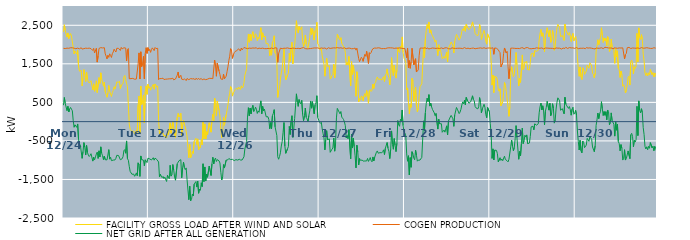
| Category | FACILITY GROSS LOAD AFTER WIND AND SOLAR | COGEN PRODUCTION | NET GRID AFTER ALL GENERATION |
|---|---|---|---|
|  Mon  12/24 | 2329 | 1903 | 426 |
|  Mon  12/24 | 2513 | 1887 | 626 |
|  Mon  12/24 | 2366 | 1895 | 471 |
|  Mon  12/24 | 2353 | 1905 | 448 |
|  Mon  12/24 | 2193 | 1907 | 286 |
|  Mon  12/24 | 2301 | 1905 | 396 |
|  Mon  12/24 | 2153 | 1903 | 250 |
|  Mon  12/24 | 2233 | 1903 | 330 |
|  Mon  12/24 | 2284 | 1917 | 367 |
|  Mon  12/24 | 2221 | 1897 | 324 |
|  Mon  12/24 | 2197 | 1916 | 281 |
|  Mon  12/24 | 1922 | 1897 | 25 |
|  Mon  12/24 | 1759 | 1904 | -145 |
|  Mon  12/24 | 1835 | 1919 | -84 |
|  Mon  12/24 | 1828 | 1892 | -64 |
|  Mon  12/24 | 1750 | 1899 | -149 |
|  Mon  12/24 | 1847 | 1907 | -60 |
|  Mon  12/24 | 1424 | 1891 | -467 |
|  Mon  12/24 | 1309 | 1890 | -581 |
|  Mon  12/24 | 1298 | 1905 | -607 |
|  Mon  12/24 | 1330 | 1917 | -587 |
|  Mon  12/24 | 930 | 1882 | -952 |
|  Mon  12/24 | 1126 | 1901 | -775 |
|  Mon  12/24 | 1350 | 1894 | -544 |
|  Mon  12/24 | 1235 | 1898 | -663 |
|  Mon  12/24 | 1040 | 1906 | -866 |
|  Mon  12/24 | 1283 | 1900 | -617 |
|  Mon  12/24 | 1101 | 1901 | -800 |
|  Mon  12/24 | 1032 | 1901 | -869 |
|  Mon  12/24 | 1003 | 1907 | -904 |
|  Mon  12/24 | 1025 | 1901 | -876 |
|  Mon  12/24 | 1062 | 1894 | -832 |
|  Mon  12/24 | 1085 | 1903 | -818 |
|  Mon  12/24 | 822 | 1846 | -1024 |
|  Mon  12/24 | 981 | 1902 | -921 |
|  Mon  12/24 | 789 | 1781 | -992 |
|  Mon  12/24 | 887 | 1803 | -916 |
|  Mon  12/24 | 1059 | 1901 | -842 |
|  Mon  12/24 | 756 | 1545 | -789 |
|  Mon  12/24 | 747 | 1702 | -955 |
|  Mon  12/24 | 1142 | 1899 | -757 |
|  Mon  12/24 | 992 | 1908 | -916 |
|  Mon  12/24 | 1266 | 1920 | -654 |
|  Mon  12/24 | 1095 | 1914 | -819 |
|  Mon  12/24 | 1026 | 1912 | -886 |
|  Mon  12/24 | 920 | 1905 | -985 |
|  Mon  12/24 | 1026 | 1918 | -892 |
|  Mon  12/24 | 770 | 1758 | -988 |
|  Mon  12/24 | 707 | 1700 | -993 |
|  Mon  12/24 | 633 | 1625 | -992 |
|  Mon  12/24 | 746 | 1725 | -979 |
|  Mon  12/24 | 939 | 1666 | -727 |
|  Mon  12/24 | 787 | 1760 | -973 |
|  Mon  12/24 | 792 | 1715 | -923 |
|  Mon  12/24 | 653 | 1665 | -1012 |
|  Mon  12/24 | 756 | 1763 | -1007 |
|  Mon  12/24 | 809 | 1807 | -998 |
|  Mon  12/24 | 907 | 1880 | -973 |
|  Mon  12/24 | 842 | 1835 | -993 |
|  Mon  12/24 | 856 | 1806 | -950 |
|  Mon  12/24 | 1031 | 1904 | -873 |
|  Mon  12/24 | 1029 | 1896 | -867 |
|  Mon  12/24 | 1020 | 1900 | -880 |
|  Mon  12/24 | 1050 | 1913 | -863 |
|  Mon  12/24 | 858 | 1847 | -989 |
|  Mon  12/24 | 949 | 1926 | -977 |
|  Mon  12/24 | 924 | 1887 | -963 |
|  Mon  12/24 | 987 | 1895 | -908 |
|  Mon  12/24 | 1164 | 1916 | -752 |
|  Mon  12/24 | 1198 | 1923 | -725 |
|  Mon  12/24 | 1089 | 1909 | -820 |
|  Mon  12/24 | 1073 | 1574 | -501 |
|  Mon  12/24 | 904 | 1866 | -962 |
|  Mon  12/24 | 895 | 1897 | -1002 |
|  Mon  12/24 | -46 | 1113 | -1159 |
|  Mon  12/24 | -198 | 1091 | -1289 |
|  Mon  12/24 | -193 | 1116 | -1309 |
|  Mon  12/24 | -254 | 1111 | -1365 |
|  Mon  12/24 | -247 | 1122 | -1369 |
|  Mon  12/24 | -248 | 1113 | -1361 |
|  Mon  12/24 | -318 | 1100 | -1418 |
|  Mon  12/24 | -286 | 1099 | -1385 |
|  Mon  12/24 | -225 | 1105 | -1330 |
|  Mon  12/24 | -284 | 1119 | -1403 |
|  Mon  12/24 | 431 | 1500 | -1069 |
|  Mon  12/24 | 666 | 1783 | -1117 |
|  Mon  12/24 | -316 | 1105 | -1421 |
|  Mon  12/24 | 922 | 1812 | -890 |
|  Mon  12/24 | 442 | 1427 | -985 |
|  Mon  12/24 | 531 | 1512 | -981 |
|  Mon  12/24 | 692 | 1693 | -1001 |
|  Mon  12/24 | -35 | 1110 | -1145 |
|  Mon  12/24 | 776 | 1766 | -990 |
|  Mon  12/24 | 928 | 1918 | -990 |
|  Mon  12/24 | 707 | 1769 | -1062 |
|  Mon  12/24 | 972 | 1920 | -948 |
|  Tue  12/25 | 867 | 1839 | -972 |
|  Tue  12/25 | 908 | 1875 | -967 |
|  Tue  12/25 | 815 | 1797 | -982 |
|  Tue  12/25 | 875 | 1871 | -996 |
|  Tue  12/25 | 922 | 1914 | -992 |
|  Tue  12/25 | 967 | 1903 | -936 |
|  Tue  12/25 | 842 | 1842 | -1000 |
|  Tue  12/25 | 978 | 1924 | -946 |
|  Tue  12/25 | 948 | 1896 | -948 |
|  Tue  12/25 | 891 | 1874 | -983 |
|  Tue  12/25 | 928 | 1902 | -974 |
|  Tue  12/25 | 41 | 1088 | -1047 |
|  Tue  12/25 | -320 | 1117 | -1437 |
|  Tue  12/25 | -260 | 1106 | -1366 |
|  Tue  12/25 | -296 | 1117 | -1413 |
|  Tue  12/25 | -320 | 1133 | -1453 |
|  Tue  12/25 | -294 | 1127 | -1421 |
|  Tue  12/25 | -385 | 1093 | -1478 |
|  Tue  12/25 | -347 | 1093 | -1440 |
|  Tue  12/25 | -322 | 1101 | -1423 |
|  Tue  12/25 | -427 | 1126 | -1553 |
|  Tue  12/25 | -287 | 1105 | -1392 |
|  Tue  12/25 | -348 | 1107 | -1455 |
|  Tue  12/25 | -371 | 1111 | -1482 |
|  Tue  12/25 | -31 | 1102 | -1133 |
|  Tue  12/25 | -303 | 1111 | -1414 |
|  Tue  12/25 | -284 | 1096 | -1380 |
|  Tue  12/25 | 14 | 1127 | -1113 |
|  Tue  12/25 | -174 | 1084 | -1258 |
|  Tue  12/25 | -345 | 1090 | -1435 |
|  Tue  12/25 | -414 | 1105 | -1519 |
|  Tue  12/25 | -399 | 1129 | -1528 |
|  Tue  12/25 | 115 | 1206 | -1091 |
|  Tue  12/25 | 215 | 1288 | -1073 |
|  Tue  12/25 | 121 | 1133 | -1012 |
|  Tue  12/25 | 160 | 1150 | -990 |
|  Tue  12/25 | 215 | 1203 | -988 |
|  Tue  12/25 | -355 | 1102 | -1457 |
|  Tue  12/25 | -85 | 1114 | -1199 |
|  Tue  12/25 | 37 | 1088 | -1051 |
|  Tue  12/25 | -80 | 1114 | -1194 |
|  Tue  12/25 | -128 | 1117 | -1245 |
|  Tue  12/25 | -135 | 1065 | -1200 |
|  Tue  12/25 | -381 | 1119 | -1500 |
|  Tue  12/25 | -406 | 1104 | -1510 |
|  Tue  12/25 | -936 | 1089 | -2025 |
|  Tue  12/25 | -590 | 1085 | -1675 |
|  Tue  12/25 | -942 | 1116 | -2058 |
|  Tue  12/25 | -900 | 1118 | -2018 |
|  Tue  12/25 | -769 | 1109 | -1878 |
|  Tue  12/25 | -827 | 1100 | -1927 |
|  Tue  12/25 | -510 | 1113 | -1623 |
|  Tue  12/25 | -515 | 1085 | -1600 |
|  Tue  12/25 | -431 | 1123 | -1554 |
|  Tue  12/25 | -594 | 1103 | -1697 |
|  Tue  12/25 | -448 | 1096 | -1544 |
|  Tue  12/25 | -734 | 1124 | -1858 |
|  Tue  12/25 | -654 | 1094 | -1748 |
|  Tue  12/25 | -683 | 1099 | -1782 |
|  Tue  12/25 | -468 | 1119 | -1587 |
|  Tue  12/25 | -599 | 1086 | -1685 |
|  Tue  12/25 | -1 | 1092 | -1093 |
|  Tue  12/25 | -450 | 1106 | -1556 |
|  Tue  12/25 | -60 | 1116 | -1176 |
|  Tue  12/25 | -452 | 1089 | -1541 |
|  Tue  12/25 | -262 | 1099 | -1361 |
|  Tue  12/25 | -341 | 1102 | -1443 |
|  Tue  12/25 | -336 | 1108 | -1444 |
|  Tue  12/25 | -30 | 1122 | -1152 |
|  Tue  12/25 | -40 | 1103 | -1143 |
|  Tue  12/25 | -273 | 1123 | -1396 |
|  Tue  12/25 | 24 | 1122 | -1098 |
|  Tue  12/25 | 191 | 1115 | -924 |
|  Tue  12/25 | 19 | 1115 | -1096 |
|  Tue  12/25 | 610 | 1597 | -987 |
|  Tue  12/25 | 499 | 1444 | -945 |
|  Tue  12/25 | 144 | 1178 | -1034 |
|  Tue  12/25 | 532 | 1518 | -986 |
|  Tue  12/25 | 550 | 1529 | -979 |
|  Tue  12/25 | 294 | 1310 | -1016 |
|  Tue  12/25 | 147 | 1220 | -1073 |
|  Tue  12/25 | -207 | 1108 | -1315 |
|  Tue  12/25 | -414 | 1099 | -1513 |
|  Tue  12/25 | -333 | 1093 | -1426 |
|  Tue  12/25 | 119 | 1233 | -1114 |
|  Tue  12/25 | -94 | 1110 | -1204 |
|  Tue  12/25 | -102 | 1107 | -1209 |
|  Tue  12/25 | 181 | 1179 | -998 |
|  Tue  12/25 | 295 | 1296 | -1001 |
|  Tue  12/25 | 431 | 1421 | -990 |
|  Tue  12/25 | 628 | 1586 | -958 |
|  Tue  12/25 | 738 | 1698 | -960 |
|  Tue  12/25 | 913 | 1896 | -983 |
|  Tue  12/25 | 874 | 1858 | -984 |
|  Tue  12/25 | 662 | 1640 | -978 |
|  Tue  12/25 | 751 | 1728 | -977 |
|  Wed  12/26 | 778 | 1788 | -1010 |
|  Wed  12/26 | 830 | 1819 | -989 |
|  Wed  12/26 | 814 | 1800 | -986 |
|  Wed  12/26 | 876 | 1844 | -968 |
|  Wed  12/26 | 832 | 1830 | -998 |
|  Wed  12/26 | 897 | 1889 | -992 |
|  Wed  12/26 | 922 | 1895 | -973 |
|  Wed  12/26 | 832 | 1831 | -999 |
|  Wed  12/26 | 930 | 1910 | -980 |
|  Wed  12/26 | 870 | 1863 | -993 |
|  Wed  12/26 | 897 | 1896 | -999 |
|  Wed  12/26 | 1011 | 1923 | -912 |
|  Wed  12/26 | 1202 | 1912 | -710 |
|  Wed  12/26 | 1203 | 1907 | -704 |
|  Wed  12/26 | 1374 | 1887 | -513 |
|  Wed  12/26 | 2012 | 1894 | 118 |
|  Wed  12/26 | 2274 | 1912 | 362 |
|  Wed  12/26 | 2060 | 1907 | 153 |
|  Wed  12/26 | 2273 | 1921 | 352 |
|  Wed  12/26 | 2103 | 1902 | 201 |
|  Wed  12/26 | 2255 | 1906 | 349 |
|  Wed  12/26 | 2334 | 1911 | 423 |
|  Wed  12/26 | 2164 | 1901 | 263 |
|  Wed  12/26 | 2212 | 1907 | 305 |
|  Wed  12/26 | 2279 | 1904 | 375 |
|  Wed  12/26 | 2239 | 1917 | 322 |
|  Wed  12/26 | 2101 | 1889 | 212 |
|  Wed  12/26 | 2185 | 1906 | 279 |
|  Wed  12/26 | 2150 | 1907 | 243 |
|  Wed  12/26 | 2312 | 1901 | 411 |
|  Wed  12/26 | 2437 | 1898 | 539 |
|  Wed  12/26 | 2120 | 1917 | 203 |
|  Wed  12/26 | 2305 | 1907 | 398 |
|  Wed  12/26 | 2199 | 1919 | 280 |
|  Wed  12/26 | 2220 | 1895 | 325 |
|  Wed  12/26 | 2212 | 1904 | 308 |
|  Wed  12/26 | 2018 | 1892 | 126 |
|  Wed  12/26 | 2015 | 1896 | 119 |
|  Wed  12/26 | 2027 | 1900 | 127 |
|  Wed  12/26 | 1955 | 1904 | 51 |
|  Wed  12/26 | 1710 | 1895 | -185 |
|  Wed  12/26 | 1863 | 1888 | -25 |
|  Wed  12/26 | 1725 | 1910 | -185 |
|  Wed  12/26 | 2060 | 1906 | 154 |
|  Wed  12/26 | 2109 | 1894 | 215 |
|  Wed  12/26 | 2228 | 1917 | 311 |
|  Wed  12/26 | 1779 | 1915 | -136 |
|  Wed  12/26 | 1742 | 1899 | -157 |
|  Wed  12/26 | 1549 | 1911 | -362 |
|  Wed  12/26 | 629 | 1540 | -911 |
|  Wed  12/26 | 792 | 1768 | -976 |
|  Wed  12/26 | 862 | 1766 | -904 |
|  Wed  12/26 | 1098 | 1907 | -809 |
|  Wed  12/26 | 1262 | 1895 | -633 |
|  Wed  12/26 | 1378 | 1893 | -515 |
|  Wed  12/26 | 1634 | 1910 | -276 |
|  Wed  12/26 | 1881 | 1905 | -24 |
|  Wed  12/26 | 1264 | 1900 | -636 |
|  Wed  12/26 | 1080 | 1903 | -823 |
|  Wed  12/26 | 1087 | 1911 | -824 |
|  Wed  12/26 | 1208 | 1913 | -705 |
|  Wed  12/26 | 1261 | 1904 | -643 |
|  Wed  12/26 | 1775 | 1899 | -124 |
|  Wed  12/26 | 1562 | 1895 | -333 |
|  Wed  12/26 | 1908 | 1896 | 12 |
|  Wed  12/26 | 2060 | 1906 | 154 |
|  Wed  12/26 | 1502 | 1909 | -407 |
|  Wed  12/26 | 1729 | 1909 | -180 |
|  Wed  12/26 | 1982 | 1902 | 80 |
|  Wed  12/26 | 2300 | 1893 | 407 |
|  Wed  12/26 | 2618 | 1897 | 721 |
|  Wed  12/26 | 2395 | 1886 | 509 |
|  Wed  12/26 | 2299 | 1903 | 396 |
|  Wed  12/26 | 2468 | 1896 | 572 |
|  Wed  12/26 | 2384 | 1892 | 492 |
|  Wed  12/26 | 2373 | 1912 | 461 |
|  Wed  12/26 | 2462 | 1910 | 552 |
|  Wed  12/26 | 2076 | 1894 | 182 |
|  Wed  12/26 | 1949 | 1922 | 27 |
|  Wed  12/26 | 2050 | 1900 | 150 |
|  Wed  12/26 | 2248 | 1895 | 353 |
|  Wed  12/26 | 2010 | 1898 | 112 |
|  Wed  12/26 | 1958 | 1888 | 70 |
|  Wed  12/26 | 1908 | 1906 | 2 |
|  Wed  12/26 | 2050 | 1892 | 158 |
|  Wed  12/26 | 2180 | 1901 | 279 |
|  Wed  12/26 | 2433 | 1897 | 536 |
|  Wed  12/26 | 2259 | 1910 | 349 |
|  Wed  12/26 | 2422 | 1904 | 518 |
|  Wed  12/26 | 2440 | 1898 | 542 |
|  Wed  12/26 | 2117 | 1912 | 205 |
|  Wed  12/26 | 2358 | 1920 | 438 |
|  Wed  12/26 | 2397 | 1910 | 487 |
|  Wed  12/26 | 2576 | 1904 | 672 |
|  Wed  12/26 | 2019 | 1913 | 106 |
|  Wed  12/26 | 1988 | 1904 | 84 |
|  Thu  12/27 | 1882 | 1896 | -14 |
|  Thu  12/27 | 1853 | 1897 | -44 |
|  Thu  12/27 | 1894 | 1912 | -18 |
|  Thu  12/27 | 1709 | 1899 | -190 |
|  Thu  12/27 | 1591 | 1902 | -311 |
|  Thu  12/27 | 1487 | 1911 | -424 |
|  Thu  12/27 | 1178 | 1911 | -733 |
|  Thu  12/27 | 1439 | 1903 | -464 |
|  Thu  12/27 | 1650 | 1884 | -234 |
|  Thu  12/27 | 1436 | 1906 | -470 |
|  Thu  12/27 | 1431 | 1917 | -486 |
|  Thu  12/27 | 1448 | 1895 | -447 |
|  Thu  12/27 | 1103 | 1899 | -796 |
|  Thu  12/27 | 1130 | 1910 | -780 |
|  Thu  12/27 | 1192 | 1907 | -715 |
|  Thu  12/27 | 1218 | 1903 | -685 |
|  Thu  12/27 | 1488 | 1914 | -426 |
|  Thu  12/27 | 1137 | 1903 | -766 |
|  Thu  12/27 | 1329 | 1911 | -582 |
|  Thu  12/27 | 1999 | 1903 | 96 |
|  Thu  12/27 | 2265 | 1921 | 344 |
|  Thu  12/27 | 2267 | 1902 | 365 |
|  Thu  12/27 | 2158 | 1909 | 249 |
|  Thu  12/27 | 2117 | 1913 | 204 |
|  Thu  12/27 | 2179 | 1916 | 263 |
|  Thu  12/27 | 2029 | 1912 | 117 |
|  Thu  12/27 | 1990 | 1902 | 88 |
|  Thu  12/27 | 1976 | 1922 | 54 |
|  Thu  12/27 | 1905 | 1915 | -10 |
|  Thu  12/27 | 1801 | 1905 | -104 |
|  Thu  12/27 | 1467 | 1891 | -424 |
|  Thu  12/27 | 1540 | 1903 | -363 |
|  Thu  12/27 | 1466 | 1907 | -441 |
|  Thu  12/27 | 1689 | 1897 | -208 |
|  Thu  12/27 | 1703 | 1906 | -203 |
|  Thu  12/27 | 929 | 1892 | -963 |
|  Thu  12/27 | 1558 | 1891 | -333 |
|  Thu  12/27 | 1226 | 1911 | -685 |
|  Thu  12/27 | 1462 | 1893 | -431 |
|  Thu  12/27 | 1267 | 1917 | -650 |
|  Thu  12/27 | 1022 | 1909 | -887 |
|  Thu  12/27 | 656 | 1855 | -1199 |
|  Thu  12/27 | 1294 | 1906 | -612 |
|  Thu  12/27 | 1122 | 1906 | -784 |
|  Thu  12/27 | 511 | 1636 | -1125 |
|  Thu  12/27 | 599 | 1556 | -957 |
|  Thu  12/27 | 557 | 1561 | -1004 |
|  Thu  12/27 | 668 | 1669 | -1001 |
|  Thu  12/27 | 641 | 1638 | -997 |
|  Thu  12/27 | 540 | 1564 | -1024 |
|  Thu  12/27 | 669 | 1668 | -999 |
|  Thu  12/27 | 727 | 1748 | -1021 |
|  Thu  12/27 | 652 | 1694 | -1042 |
|  Thu  12/27 | 805 | 1825 | -1020 |
|  Thu  12/27 | 697 | 1652 | -955 |
|  Thu  12/27 | 477 | 1509 | -1032 |
|  Thu  12/27 | 800 | 1789 | -989 |
|  Thu  12/27 | 831 | 1763 | -932 |
|  Thu  12/27 | 782 | 1791 | -1009 |
|  Thu  12/27 | 812 | 1854 | -1042 |
|  Thu  12/27 | 976 | 1892 | -916 |
|  Thu  12/27 | 861 | 1880 | -1019 |
|  Thu  12/27 | 987 | 1910 | -923 |
|  Thu  12/27 | 1016 | 1925 | -909 |
|  Thu  12/27 | 1114 | 1906 | -792 |
|  Thu  12/27 | 1160 | 1920 | -760 |
|  Thu  12/27 | 1097 | 1916 | -819 |
|  Thu  12/27 | 1099 | 1904 | -805 |
|  Thu  12/27 | 1105 | 1909 | -804 |
|  Thu  12/27 | 1082 | 1897 | -815 |
|  Thu  12/27 | 1083 | 1892 | -809 |
|  Thu  12/27 | 1127 | 1910 | -783 |
|  Thu  12/27 | 1165 | 1897 | -732 |
|  Thu  12/27 | 1040 | 1894 | -854 |
|  Thu  12/27 | 1199 | 1893 | -694 |
|  Thu  12/27 | 1243 | 1914 | -671 |
|  Thu  12/27 | 1368 | 1910 | -542 |
|  Thu  12/27 | 1202 | 1894 | -692 |
|  Thu  12/27 | 1146 | 1916 | -770 |
|  Thu  12/27 | 951 | 1910 | -959 |
|  Thu  12/27 | 1196 | 1914 | -718 |
|  Thu  12/27 | 1660 | 1901 | -241 |
|  Thu  12/27 | 1323 | 1912 | -589 |
|  Thu  12/27 | 1193 | 1909 | -716 |
|  Thu  12/27 | 1461 | 1900 | -439 |
|  Thu  12/27 | 1276 | 1890 | -614 |
|  Thu  12/27 | 1130 | 1908 | -778 |
|  Thu  12/27 | 1348 | 1908 | -560 |
|  Thu  12/27 | 1930 | 1904 | 26 |
|  Thu  12/27 | 1828 | 1908 | -80 |
|  Thu  12/27 | 1793 | 1914 | -121 |
|  Thu  12/27 | 1955 | 1891 | 64 |
|  Thu  12/27 | 1918 | 1904 | 14 |
|  Thu  12/27 | 2198 | 1896 | 302 |
|  Thu  12/27 | 1793 | 1898 | -105 |
|  Thu  12/27 | 1641 | 1904 | -263 |
|  Fri  12/28 | 1603 | 1898 | -295 |
|  Fri  12/28 | 1534 | 1907 | -373 |
|  Fri  12/28 | 823 | 1660 | -837 |
|  Fri  12/28 | 875 | 1902 | -1027 |
|  Fri  12/28 | 516 | 1401 | -885 |
|  Fri  12/28 | 199 | 1583 | -1384 |
|  Fri  12/28 | 451 | 1384 | -933 |
|  Fri  12/28 | 372 | 1556 | -1184 |
|  Fri  12/28 | 1123 | 1903 | -780 |
|  Fri  12/28 | 1060 | 1900 | -840 |
|  Fri  12/28 | 525 | 1470 | -945 |
|  Fri  12/28 | 504 | 1494 | -990 |
|  Fri  12/28 | 892 | 1632 | -740 |
|  Fri  12/28 | 412 | 1287 | -875 |
|  Fri  12/28 | 254 | 1280 | -1026 |
|  Fri  12/28 | 343 | 1342 | -999 |
|  Fri  12/28 | 691 | 1709 | -1018 |
|  Fri  12/28 | 909 | 1906 | -997 |
|  Fri  12/28 | 922 | 1911 | -989 |
|  Fri  12/28 | 982 | 1909 | -927 |
|  Fri  12/28 | 986 | 1915 | -929 |
|  Fri  12/28 | 1926 | 1906 | 20 |
|  Fri  12/28 | 1658 | 1898 | -240 |
|  Fri  12/28 | 2149 | 1919 | 230 |
|  Fri  12/28 | 2361 | 1888 | 473 |
|  Fri  12/28 | 2521 | 1914 | 607 |
|  Fri  12/28 | 2418 | 1896 | 522 |
|  Fri  12/28 | 2586 | 1886 | 700 |
|  Fri  12/28 | 2308 | 1904 | 404 |
|  Fri  12/28 | 2380 | 1898 | 482 |
|  Fri  12/28 | 2272 | 1888 | 384 |
|  Fri  12/28 | 2228 | 1911 | 317 |
|  Fri  12/28 | 2214 | 1907 | 307 |
|  Fri  12/28 | 2133 | 1905 | 228 |
|  Fri  12/28 | 2061 | 1907 | 154 |
|  Fri  12/28 | 2113 | 1900 | 213 |
|  Fri  12/28 | 2126 | 1916 | 210 |
|  Fri  12/28 | 1713 | 1906 | -193 |
|  Fri  12/28 | 1994 | 1928 | 66 |
|  Fri  12/28 | 1841 | 1896 | -55 |
|  Fri  12/28 | 1872 | 1916 | -44 |
|  Fri  12/28 | 1860 | 1914 | -54 |
|  Fri  12/28 | 1627 | 1903 | -276 |
|  Fri  12/28 | 1617 | 1894 | -277 |
|  Fri  12/28 | 1691 | 1910 | -219 |
|  Fri  12/28 | 1641 | 1914 | -273 |
|  Fri  12/28 | 1730 | 1915 | -185 |
|  Fri  12/28 | 1807 | 1916 | -109 |
|  Fri  12/28 | 1551 | 1894 | -343 |
|  Fri  12/28 | 1908 | 1893 | 15 |
|  Fri  12/28 | 1915 | 1903 | 12 |
|  Fri  12/28 | 2006 | 1886 | 120 |
|  Fri  12/28 | 2068 | 1906 | 162 |
|  Fri  12/28 | 2092 | 1916 | 176 |
|  Fri  12/28 | 1977 | 1904 | 73 |
|  Fri  12/28 | 1780 | 1902 | -122 |
|  Fri  12/28 | 2085 | 1916 | 169 |
|  Fri  12/28 | 2088 | 1900 | 188 |
|  Fri  12/28 | 2263 | 1896 | 367 |
|  Fri  12/28 | 2225 | 1903 | 322 |
|  Fri  12/28 | 2238 | 1923 | 315 |
|  Fri  12/28 | 2113 | 1905 | 208 |
|  Fri  12/28 | 2154 | 1907 | 247 |
|  Fri  12/28 | 2223 | 1903 | 320 |
|  Fri  12/28 | 2343 | 1912 | 431 |
|  Fri  12/28 | 2407 | 1895 | 512 |
|  Fri  12/28 | 2364 | 1902 | 462 |
|  Fri  12/28 | 2473 | 1921 | 552 |
|  Fri  12/28 | 2344 | 1907 | 437 |
|  Fri  12/28 | 2525 | 1896 | 629 |
|  Fri  12/28 | 2465 | 1902 | 563 |
|  Fri  12/28 | 2454 | 1906 | 548 |
|  Fri  12/28 | 2389 | 1912 | 477 |
|  Fri  12/28 | 2366 | 1892 | 474 |
|  Fri  12/28 | 2435 | 1917 | 518 |
|  Fri  12/28 | 2427 | 1903 | 524 |
|  Fri  12/28 | 2587 | 1917 | 670 |
|  Fri  12/28 | 2479 | 1909 | 570 |
|  Fri  12/28 | 2444 | 1905 | 539 |
|  Fri  12/28 | 2282 | 1891 | 391 |
|  Fri  12/28 | 2253 | 1897 | 356 |
|  Fri  12/28 | 2236 | 1901 | 335 |
|  Fri  12/28 | 2230 | 1899 | 331 |
|  Fri  12/28 | 2290 | 1906 | 384 |
|  Fri  12/28 | 2523 | 1900 | 623 |
|  Fri  12/28 | 2412 | 1913 | 499 |
|  Fri  12/28 | 2133 | 1908 | 225 |
|  Fri  12/28 | 2230 | 1902 | 328 |
|  Fri  12/28 | 2241 | 1913 | 328 |
|  Fri  12/28 | 2367 | 1917 | 450 |
|  Fri  12/28 | 2269 | 1899 | 370 |
|  Fri  12/28 | 2081 | 1899 | 182 |
|  Fri  12/28 | 2009 | 1908 | 101 |
|  Fri  12/28 | 2277 | 1909 | 368 |
|  Fri  12/28 | 2272 | 1884 | 388 |
|  Fri  12/28 | 2168 | 1911 | 257 |
|  Sat  12/29 | 1862 | 1913 | -51 |
|  Sat  12/29 | 1582 | 1905 | -323 |
|  Sat  12/29 | 948 | 1902 | -954 |
|  Sat  12/29 | 1210 | 1916 | -706 |
|  Sat  12/29 | 753 | 1747 | -994 |
|  Sat  12/29 | 1173 | 1912 | -739 |
|  Sat  12/29 | 1173 | 1919 | -746 |
|  Sat  12/29 | 1155 | 1902 | -747 |
|  Sat  12/29 | 1075 | 1905 | -830 |
|  Sat  12/29 | 819 | 1866 | -1047 |
|  Sat  12/29 | 788 | 1823 | -1035 |
|  Sat  12/29 | 853 | 1790 | -937 |
|  Sat  12/29 | 414 | 1420 | -1006 |
|  Sat  12/29 | 433 | 1402 | -969 |
|  Sat  12/29 | 517 | 1531 | -1014 |
|  Sat  12/29 | 751 | 1770 | -1019 |
|  Sat  12/29 | 1015 | 1911 | -896 |
|  Sat  12/29 | 942 | 1923 | -981 |
|  Sat  12/29 | 784 | 1780 | -996 |
|  Sat  12/29 | 804 | 1820 | -1016 |
|  Sat  12/29 | 379 | 1422 | -1043 |
|  Sat  12/29 | 138 | 1113 | -975 |
|  Sat  12/29 | 387 | 1379 | -992 |
|  Sat  12/29 | 1250 | 1906 | -656 |
|  Sat  12/29 | 1425 | 1905 | -480 |
|  Sat  12/29 | 1269 | 1907 | -638 |
|  Sat  12/29 | 1165 | 1921 | -756 |
|  Sat  12/29 | 1233 | 1903 | -670 |
|  Sat  12/29 | 1464 | 1909 | -445 |
|  Sat  12/29 | 1794 | 1898 | -104 |
|  Sat  12/29 | 1472 | 1887 | -415 |
|  Sat  12/29 | 1463 | 1900 | -437 |
|  Sat  12/29 | 923 | 1899 | -976 |
|  Sat  12/29 | 1121 | 1896 | -775 |
|  Sat  12/29 | 1018 | 1908 | -890 |
|  Sat  12/29 | 1338 | 1916 | -578 |
|  Sat  12/29 | 1731 | 1899 | -168 |
|  Sat  12/29 | 1346 | 1915 | -569 |
|  Sat  12/29 | 1388 | 1885 | -497 |
|  Sat  12/29 | 1556 | 1908 | -352 |
|  Sat  12/29 | 1518 | 1917 | -399 |
|  Sat  12/29 | 1567 | 1911 | -344 |
|  Sat  12/29 | 1351 | 1921 | -570 |
|  Sat  12/29 | 1329 | 1905 | -576 |
|  Sat  12/29 | 1339 | 1895 | -556 |
|  Sat  12/29 | 1538 | 1920 | -382 |
|  Sat  12/29 | 1756 | 1890 | -134 |
|  Sat  12/29 | 1773 | 1902 | -129 |
|  Sat  12/29 | 1779 | 1899 | -120 |
|  Sat  12/29 | 1686 | 1899 | -213 |
|  Sat  12/29 | 1840 | 1898 | -58 |
|  Sat  12/29 | 1824 | 1905 | -81 |
|  Sat  12/29 | 1825 | 1916 | -91 |
|  Sat  12/29 | 1842 | 1927 | -85 |
|  Sat  12/29 | 1851 | 1906 | -55 |
|  Sat  12/29 | 2121 | 1892 | 229 |
|  Sat  12/29 | 2295 | 1904 | 391 |
|  Sat  12/29 | 2390 | 1910 | 480 |
|  Sat  12/29 | 2215 | 1912 | 303 |
|  Sat  12/29 | 2304 | 1893 | 411 |
|  Sat  12/29 | 2170 | 1887 | 283 |
|  Sat  12/29 | 1809 | 1895 | -86 |
|  Sat  12/29 | 2179 | 1910 | 269 |
|  Sat  12/29 | 2297 | 1924 | 373 |
|  Sat  12/29 | 2435 | 1908 | 527 |
|  Sat  12/29 | 2435 | 1896 | 539 |
|  Sat  12/29 | 2203 | 1904 | 299 |
|  Sat  12/29 | 2372 | 1895 | 477 |
|  Sat  12/29 | 2058 | 1903 | 155 |
|  Sat  12/29 | 2128 | 1909 | 219 |
|  Sat  12/29 | 2367 | 1901 | 466 |
|  Sat  12/29 | 2259 | 1909 | 350 |
|  Sat  12/29 | 1851 | 1889 | -38 |
|  Sat  12/29 | 1955 | 1914 | 41 |
|  Sat  12/29 | 2238 | 1912 | 326 |
|  Sat  12/29 | 2422 | 1919 | 503 |
|  Sat  12/29 | 2524 | 1906 | 618 |
|  Sat  12/29 | 2518 | 1917 | 601 |
|  Sat  12/29 | 2447 | 1906 | 541 |
|  Sat  12/29 | 2206 | 1910 | 296 |
|  Sat  12/29 | 2192 | 1884 | 308 |
|  Sat  12/29 | 2233 | 1896 | 337 |
|  Sat  12/29 | 2179 | 1908 | 271 |
|  Sat  12/29 | 2107 | 1904 | 203 |
|  Sat  12/29 | 2531 | 1899 | 632 |
|  Sat  12/29 | 2384 | 1928 | 456 |
|  Sat  12/29 | 2327 | 1916 | 411 |
|  Sat  12/29 | 2307 | 1897 | 410 |
|  Sat  12/29 | 2243 | 1899 | 344 |
|  Sat  12/29 | 2313 | 1922 | 391 |
|  Sat  12/29 | 2218 | 1912 | 306 |
|  Sat  12/29 | 2079 | 1912 | 167 |
|  Sat  12/29 | 2229 | 1905 | 324 |
|  Sat  12/29 | 2288 | 1913 | 375 |
|  Sat  12/29 | 2098 | 1906 | 192 |
|  Sat  12/29 | 2119 | 1900 | 219 |
|  Sun  12/30 | 2207 | 1914 | 293 |
|  Sun  12/30 | 2093 | 1923 | 170 |
|  Sun  12/30 | 1656 | 1899 | -243 |
|  Sun  12/30 | 1377 | 1892 | -515 |
|  Sun  12/30 | 1177 | 1913 | -736 |
|  Sun  12/30 | 1419 | 1904 | -485 |
|  Sun  12/30 | 1160 | 1916 | -756 |
|  Sun  12/30 | 1093 | 1903 | -810 |
|  Sun  12/30 | 1398 | 1901 | -503 |
|  Sun  12/30 | 1369 | 1907 | -538 |
|  Sun  12/30 | 1226 | 1902 | -676 |
|  Sun  12/30 | 1206 | 1892 | -686 |
|  Sun  12/30 | 1312 | 1920 | -608 |
|  Sun  12/30 | 1470 | 1903 | -433 |
|  Sun  12/30 | 1492 | 1908 | -416 |
|  Sun  12/30 | 1386 | 1899 | -513 |
|  Sun  12/30 | 1527 | 1913 | -386 |
|  Sun  12/30 | 1497 | 1918 | -421 |
|  Sun  12/30 | 1445 | 1905 | -460 |
|  Sun  12/30 | 1251 | 1908 | -657 |
|  Sun  12/30 | 1225 | 1894 | -669 |
|  Sun  12/30 | 1136 | 1916 | -780 |
|  Sun  12/30 | 1263 | 1885 | -622 |
|  Sun  12/30 | 1812 | 1911 | -99 |
|  Sun  12/30 | 1951 | 1906 | 45 |
|  Sun  12/30 | 2126 | 1904 | 222 |
|  Sun  12/30 | 1995 | 1917 | 78 |
|  Sun  12/30 | 2109 | 1904 | 205 |
|  Sun  12/30 | 2185 | 1916 | 269 |
|  Sun  12/30 | 2434 | 1917 | 517 |
|  Sun  12/30 | 2235 | 1901 | 334 |
|  Sun  12/30 | 2054 | 1895 | 159 |
|  Sun  12/30 | 2173 | 1911 | 262 |
|  Sun  12/30 | 2092 | 1927 | 165 |
|  Sun  12/30 | 2160 | 1902 | 258 |
|  Sun  12/30 | 1970 | 1921 | 49 |
|  Sun  12/30 | 2207 | 1905 | 302 |
|  Sun  12/30 | 2173 | 1911 | 262 |
|  Sun  12/30 | 1821 | 1902 | -81 |
|  Sun  12/30 | 1889 | 1910 | -21 |
|  Sun  12/30 | 2140 | 1913 | 227 |
|  Sun  12/30 | 1931 | 1908 | 23 |
|  Sun  12/30 | 1924 | 1882 | 42 |
|  Sun  12/30 | 1845 | 1911 | -66 |
|  Sun  12/30 | 1512 | 1888 | -376 |
|  Sun  12/30 | 1908 | 1910 | -2 |
|  Sun  12/30 | 1686 | 1908 | -222 |
|  Sun  12/30 | 1836 | 1903 | -67 |
|  Sun  12/30 | 1379 | 1896 | -517 |
|  Sun  12/30 | 1341 | 1912 | -571 |
|  Sun  12/30 | 1146 | 1902 | -756 |
|  Sun  12/30 | 1314 | 1910 | -596 |
|  Sun  12/30 | 1215 | 1909 | -694 |
|  Sun  12/30 | 917 | 1914 | -997 |
|  Sun  12/30 | 957 | 1908 | -951 |
|  Sun  12/30 | 900 | 1628 | -728 |
|  Sun  12/30 | 744 | 1741 | -997 |
|  Sun  12/30 | 810 | 1769 | -959 |
|  Sun  12/30 | 946 | 1917 | -971 |
|  Sun  12/30 | 1145 | 1905 | -760 |
|  Sun  12/30 | 1179 | 1927 | -748 |
|  Sun  12/30 | 949 | 1907 | -958 |
|  Sun  12/30 | 1554 | 1897 | -343 |
|  Sun  12/30 | 1596 | 1900 | -304 |
|  Sun  12/30 | 1530 | 1911 | -381 |
|  Sun  12/30 | 1239 | 1891 | -652 |
|  Sun  12/30 | 1424 | 1907 | -483 |
|  Sun  12/30 | 1380 | 1910 | -530 |
|  Sun  12/30 | 1440 | 1904 | -464 |
|  Sun  12/30 | 2289 | 1892 | 397 |
|  Sun  12/30 | 1551 | 1912 | -361 |
|  Sun  12/30 | 2432 | 1894 | 538 |
|  Sun  12/30 | 2191 | 1897 | 294 |
|  Sun  12/30 | 2128 | 1902 | 226 |
|  Sun  12/30 | 2258 | 1922 | 336 |
|  Sun  12/30 | 2141 | 1907 | 234 |
|  Sun  12/30 | 1751 | 1905 | -154 |
|  Sun  12/30 | 1578 | 1916 | -338 |
|  Sun  12/30 | 1263 | 1908 | -645 |
|  Sun  12/30 | 1195 | 1905 | -710 |
|  Sun  12/30 | 1267 | 1918 | -651 |
|  Sun  12/30 | 1184 | 1914 | -730 |
|  Sun  12/30 | 1267 | 1908 | -641 |
|  Sun  12/30 | 1208 | 1900 | -692 |
|  Sun  12/30 | 1357 | 1901 | -544 |
|  Sun  12/30 | 1352 | 1909 | -557 |
|  Sun  12/30 | 1218 | 1899 | -681 |
|  Sun  12/30 | 1276 | 1911 | -635 |
|  Sun  12/30 | 1161 | 1917 | -756 |
|  Sun  12/30 | 1262 | 1903 | -641 |
|  Sun  12/30 | 1227 | 1907 | -680 |
|  Sun  12/30 | 1137 | 1906 | -769 |